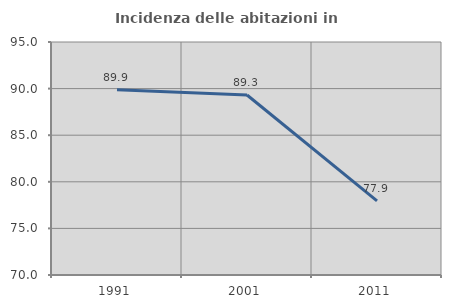
| Category | Incidenza delle abitazioni in proprietà  |
|---|---|
| 1991.0 | 89.864 |
| 2001.0 | 89.313 |
| 2011.0 | 77.949 |